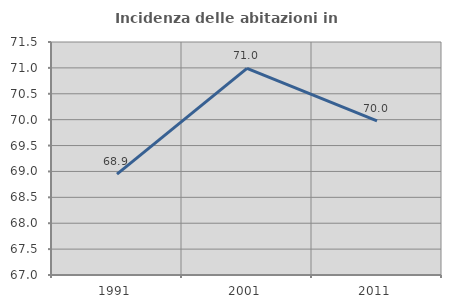
| Category | Incidenza delle abitazioni in proprietà  |
|---|---|
| 1991.0 | 68.949 |
| 2001.0 | 70.99 |
| 2011.0 | 69.976 |